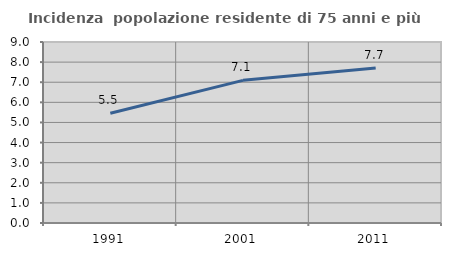
| Category | Incidenza  popolazione residente di 75 anni e più |
|---|---|
| 1991.0 | 5.454 |
| 2001.0 | 7.092 |
| 2011.0 | 7.701 |